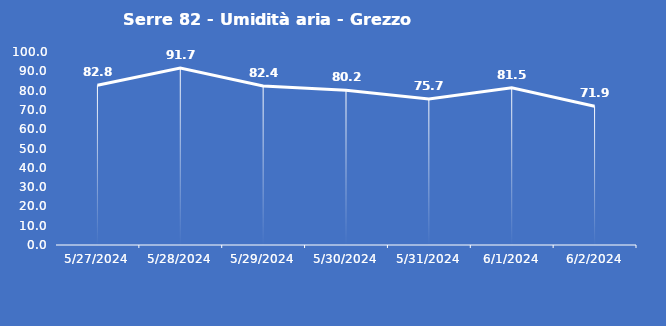
| Category | Serre 82 - Umidità aria - Grezzo (%) |
|---|---|
| 5/27/24 | 82.8 |
| 5/28/24 | 91.7 |
| 5/29/24 | 82.4 |
| 5/30/24 | 80.2 |
| 5/31/24 | 75.7 |
| 6/1/24 | 81.5 |
| 6/2/24 | 71.9 |